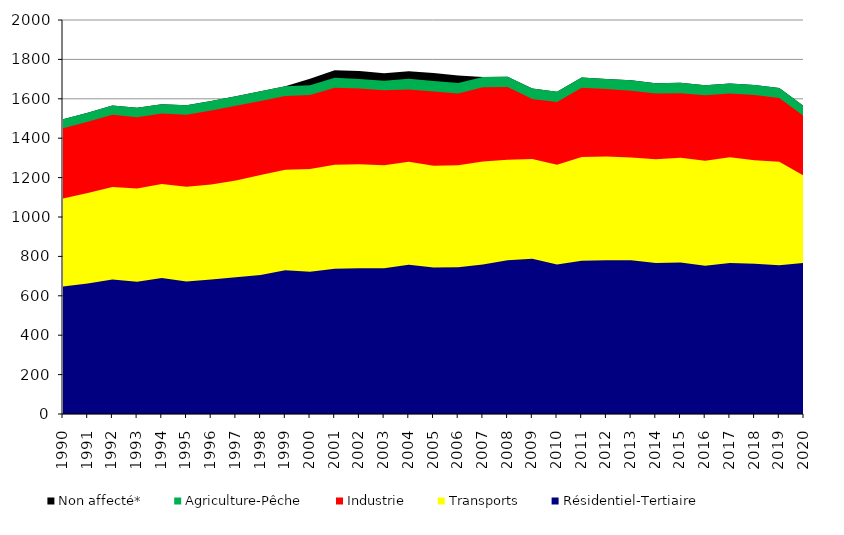
| Category | Non affecté* | Agriculture-Pêche | Industrie | Transports | Résidentiel-Tertiaire |
|---|---|---|---|---|---|
| 1990.0 | 1495.658 | 1495.658 | 1450.26 | 1094.415 | 646.826 |
| 1991.0 | 1529.668 | 1529.668 | 1483.882 | 1122.041 | 662.03 |
| 1992.0 | 1565.856 | 1565.856 | 1519.222 | 1152.322 | 682.951 |
| 1993.0 | 1554.137 | 1554.137 | 1506.648 | 1144.606 | 671.297 |
| 1994.0 | 1572.707 | 1572.707 | 1525.955 | 1167.047 | 689.924 |
| 1995.0 | 1566.65 | 1566.65 | 1519.63 | 1154.064 | 673.216 |
| 1996.0 | 1588.877 | 1588.877 | 1540.406 | 1164.703 | 683.338 |
| 1997.0 | 1613.009 | 1613.009 | 1564.941 | 1185.911 | 694.384 |
| 1998.0 | 1637.916 | 1637.916 | 1588.698 | 1213.588 | 705.529 |
| 1999.0 | 1663.626 | 1663.626 | 1614.567 | 1239.835 | 729.901 |
| 2000.0 | 1701.254 | 1668.884 | 1619.407 | 1243.487 | 722.053 |
| 2001.0 | 1745.134 | 1706.858 | 1656.45 | 1264.945 | 737.169 |
| 2002.0 | 1741.656 | 1700.531 | 1651.753 | 1267.189 | 739.691 |
| 2003.0 | 1729.612 | 1691.437 | 1642.954 | 1262.132 | 740.337 |
| 2004.0 | 1740.241 | 1701.858 | 1647.302 | 1280.15 | 757.686 |
| 2005.0 | 1731.509 | 1690.805 | 1636.606 | 1259.655 | 743.536 |
| 2006.0 | 1718.549 | 1680.12 | 1627.176 | 1263.013 | 744.712 |
| 2007.0 | 1710.22 | 1710.22 | 1658.869 | 1281.889 | 758.853 |
| 2008.0 | 1711.733 | 1711.733 | 1659.841 | 1290.84 | 780.307 |
| 2009.0 | 1651.791 | 1651.791 | 1599.427 | 1293.986 | 787.548 |
| 2010.0 | 1635.445 | 1635.445 | 1583.171 | 1265.67 | 758.929 |
| 2011.0 | 1708.381 | 1708.381 | 1656.105 | 1305.121 | 777.596 |
| 2012.0 | 1700.108 | 1700.108 | 1649.212 | 1306.92 | 780.694 |
| 2013.0 | 1693.955 | 1693.955 | 1640.827 | 1302.443 | 780.096 |
| 2014.0 | 1678.921 | 1678.921 | 1626.439 | 1292.556 | 766.819 |
| 2015.0 | 1680.881 | 1680.881 | 1628.322 | 1300.262 | 769.207 |
| 2016.0 | 1669.416 | 1669.416 | 1618.411 | 1285.856 | 752.922 |
| 2017.0 | 1677.158 | 1677.158 | 1626.641 | 1303.842 | 766.849 |
| 2018.0 | 1670.542 | 1670.542 | 1619.387 | 1288.166 | 762.225 |
| 2019.0 | 1654.469 | 1654.469 | 1603.893 | 1281.06 | 755.205 |
| 2020.0 | 1561.752 | 1561.752 | 1511.195 | 1209.449 | 766.512 |